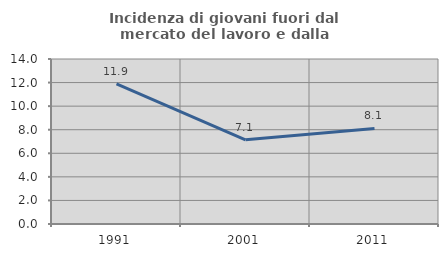
| Category | Incidenza di giovani fuori dal mercato del lavoro e dalla formazione  |
|---|---|
| 1991.0 | 11.894 |
| 2001.0 | 7.143 |
| 2011.0 | 8.108 |